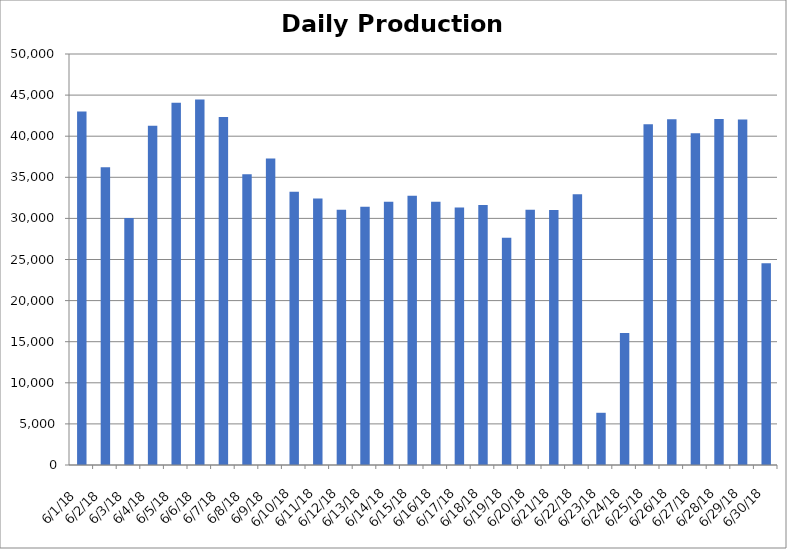
| Category | Series 0 |
|---|---|
| 6/1/18 | 43013.75 |
| 6/2/18 | 36221 |
| 6/3/18 | 30057.75 |
| 6/4/18 | 41273.25 |
| 6/5/18 | 44084.25 |
| 6/6/18 | 44466.75 |
| 6/7/18 | 42340.75 |
| 6/8/18 | 35361 |
| 6/9/18 | 37279.5 |
| 6/10/18 | 33246.5 |
| 6/11/18 | 32428.25 |
| 6/12/18 | 31061 |
| 6/13/18 | 31408 |
| 6/14/18 | 32025.25 |
| 6/15/18 | 32742.25 |
| 6/16/18 | 32017.5 |
| 6/17/18 | 31313.75 |
| 6/18/18 | 31624.25 |
| 6/19/18 | 27657.75 |
| 6/20/18 | 31057.25 |
| 6/21/18 | 31036.5 |
| 6/22/18 | 32941.5 |
| 6/23/18 | 6352.5 |
| 6/24/18 | 16056.75 |
| 6/25/18 | 41451 |
| 6/26/18 | 42056.5 |
| 6/27/18 | 40353.5 |
| 6/28/18 | 42081.75 |
| 6/29/18 | 42034.25 |
| 6/30/18 | 24535 |